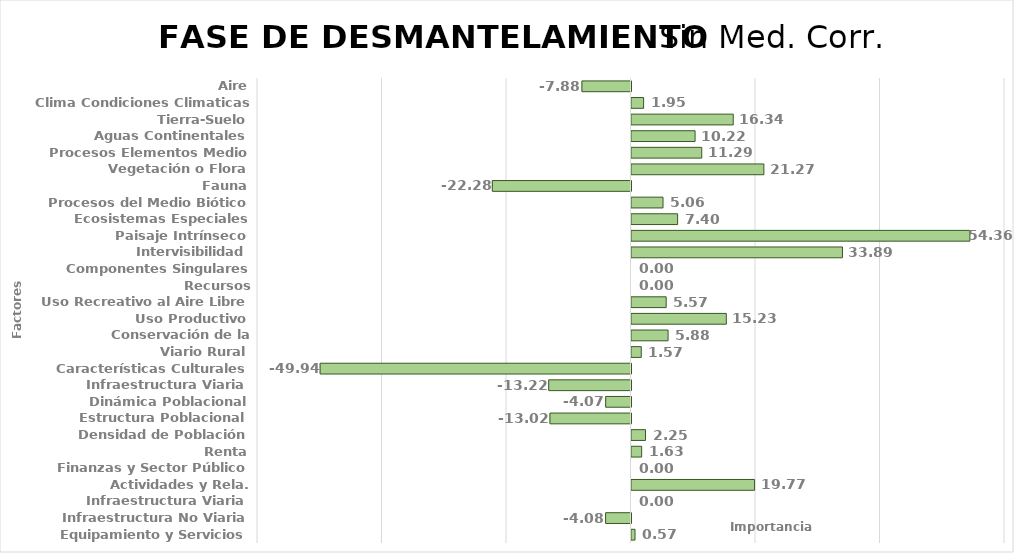
| Category | Series 0 |
|---|---|
| Aire | -7.88 |
| Clima Condiciones Climaticas | 1.946 |
| Tierra-Suelo | 16.344 |
| Aguas Continentales | 10.215 |
| Procesos Elementos Medio | 11.285 |
| Vegetación o Flora | 21.265 |
| Fauna | -22.278 |
| Procesos del Medio Biótico | 5.063 |
| Ecosistemas Especiales | 7.405 |
| Paisaje Intrínseco | 54.357 |
| Intervisibilidad | 33.888 |
| Componentes Singulares Paisaje | 0 |
| Recursos Científico-Culturales | 0 |
| Uso Recreativo al Aire Libre | 5.571 |
| Uso Productivo | 15.232 |
| Conservación de la Naturaleza | 5.875 |
| Viario Rural | 1.567 |
| Características Culturales | -49.941 |
| Infraestructura Viaria | -13.22 |
| Dinámica Poblacional | -4.068 |
| Estructura Poblacional | -13.017 |
| Densidad de Población | 2.253 |
| Renta | 1.632 |
| Finanzas y Sector Público | 0 |
| Actividades y Rela. Económicas | 19.771 |
| Infraestructura Viaria | 0 |
| Infraestructura No Viaria | -4.077 |
| Equipamiento y Servicios | 0.566 |